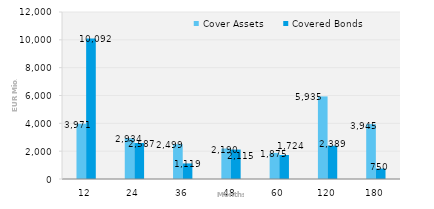
| Category | Cover Assets | Covered Bonds |
|---|---|---|
| 12.0 | 3970.577 | 10092 |
| 24.0 | 2934.183 | 2587 |
| 36.0 | 2498.58 | 1119 |
| 48.0 | 2190.227 | 2115 |
| 60.0 | 1874.863 | 1724 |
| 120.0 | 5934.704 | 2388.5 |
| 180.0 | 3945.451 | 750 |